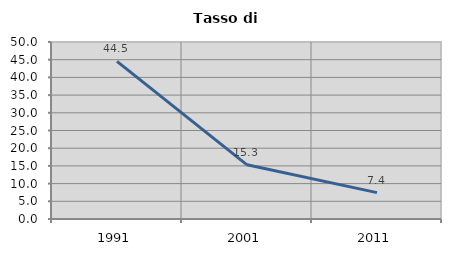
| Category | Tasso di disoccupazione   |
|---|---|
| 1991.0 | 44.528 |
| 2001.0 | 15.309 |
| 2011.0 | 7.447 |